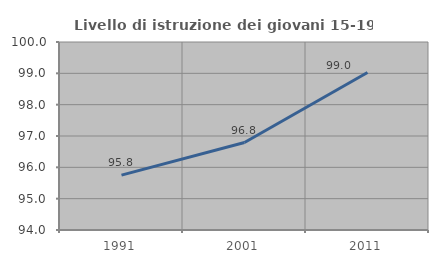
| Category | Livello di istruzione dei giovani 15-19 anni |
|---|---|
| 1991.0 | 95.753 |
| 2001.0 | 96.791 |
| 2011.0 | 99.024 |